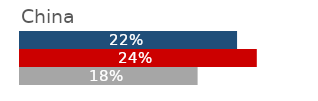
| Category | China |
|---|---|
| 2006 | 0.22 |
| 2011 | 0.24 |
| 2016 | 0.18 |